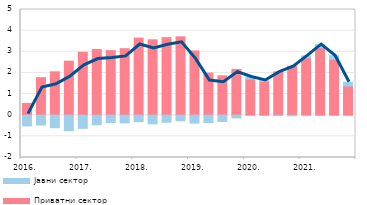
| Category | Приватни сектор | Јавни сектор |
|---|---|---|
| 2016. | 0.559 | -0.507 |
| II | 1.776 | -0.463 |
| III | 2.053 | -0.589 |
| IV | 2.556 | -0.733 |
| 2017. | 2.977 | -0.621 |
| II | 3.109 | -0.452 |
| III | 3.055 | -0.347 |
| IV | 3.145 | -0.363 |
| 2018. | 3.649 | -0.305 |
| II | 3.567 | -0.411 |
| III | 3.668 | -0.334 |
| IV | 3.71 | -0.263 |
| 2019. | 3.039 | -0.375 |
| II | 1.992 | -0.349 |
| III | 1.862 | -0.298 |
| IV | 2.168 | -0.13 |
| 2020. | 1.708 | 0.102 |
| II | 1.599 | 0.045 |
| III | 2.051 | -0.014 |
| IV | 2.322 | -0.028 |
| 2021. | 2.718 | 0.089 |
| II | 3.189 | 0.148 |
| III | 2.641 | 0.174 |
| IV | 1.382 | 0.178 |